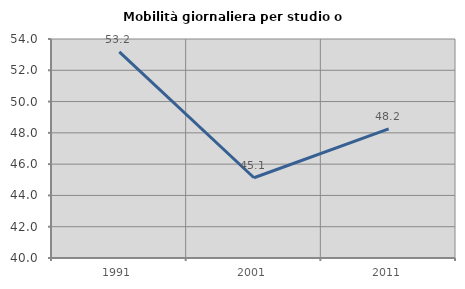
| Category | Mobilità giornaliera per studio o lavoro |
|---|---|
| 1991.0 | 53.179 |
| 2001.0 | 45.13 |
| 2011.0 | 48.249 |